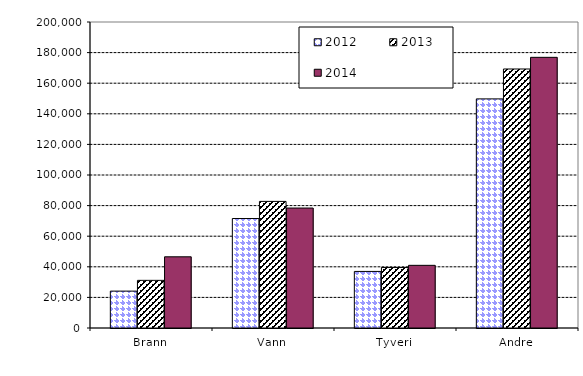
| Category | 2012 | 2013 | 2014 |
|---|---|---|---|
| Brann | 24111 | 31147 | 46530 |
| Vann | 71551 | 82744 | 78404 |
| Tyveri | 36970 | 39521 | 40957 |
| Andre | 149751 | 169287 | 176904 |